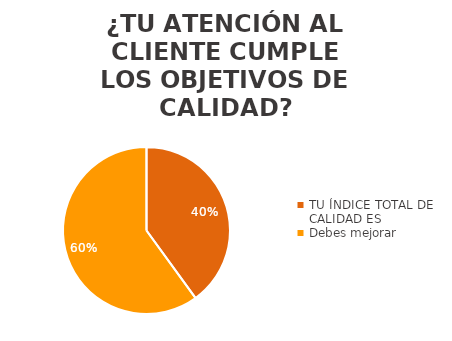
| Category | Series 0 | Series 1 |
|---|---|---|
| TU ÍNDICE TOTAL DE CALIDAD ES | 0.4 |  |
| Debes mejorar | 0.6 |  |